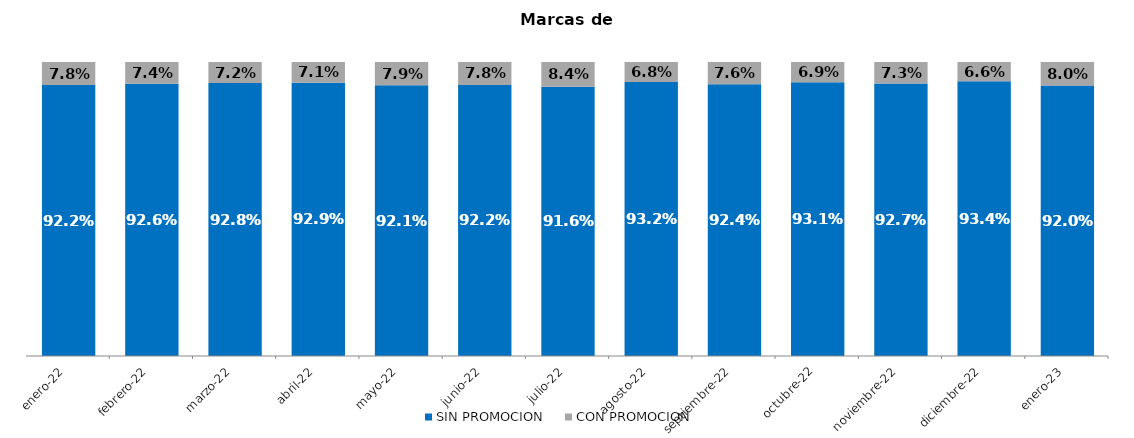
| Category | SIN PROMOCION   | CON PROMOCION   |
|---|---|---|
| 2022-01-01 | 0.922 | 0.078 |
| 2022-02-01 | 0.926 | 0.074 |
| 2022-03-01 | 0.928 | 0.072 |
| 2022-04-01 | 0.929 | 0.071 |
| 2022-05-01 | 0.921 | 0.079 |
| 2022-06-01 | 0.922 | 0.078 |
| 2022-07-01 | 0.916 | 0.084 |
| 2022-08-01 | 0.932 | 0.068 |
| 2022-09-01 | 0.924 | 0.076 |
| 2022-10-01 | 0.931 | 0.069 |
| 2022-11-01 | 0.927 | 0.073 |
| 2022-12-01 | 0.934 | 0.066 |
| 2023-01-01 | 0.92 | 0.08 |